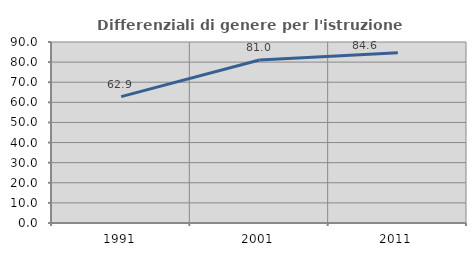
| Category | Differenziali di genere per l'istruzione superiore |
|---|---|
| 1991.0 | 62.855 |
| 2001.0 | 81.04 |
| 2011.0 | 84.606 |